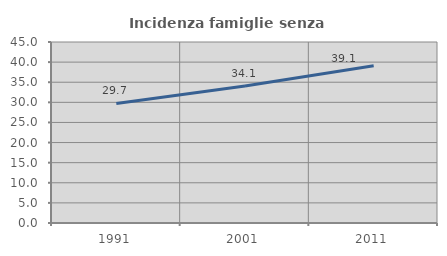
| Category | Incidenza famiglie senza nuclei |
|---|---|
| 1991.0 | 29.73 |
| 2001.0 | 34.058 |
| 2011.0 | 39.078 |